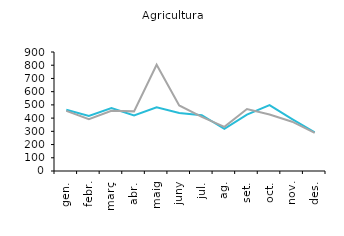
| Category | 2018 | 2019 |
|---|---|---|
| gen. | 463 | 455 |
| febr. | 417 | 392 |
| març | 476 | 456 |
| abr. | 421 | 451 |
| maig | 482 | 804 |
| juny | 438 | 496 |
| jul. | 422 | 410 |
| ag. | 319 | 334 |
| set. | 427 | 469 |
| oct. | 498 | 427 |
| nov. | 393 | 373 |
| des. | 293 | 289 |